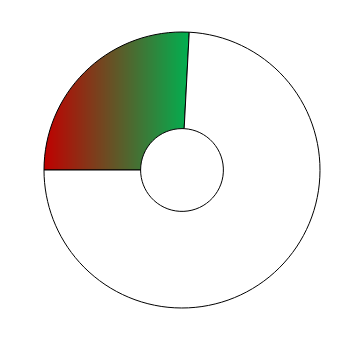
| Category | Series 0 |
|---|---|
| 0 | 93 |
| 1 | 267 |